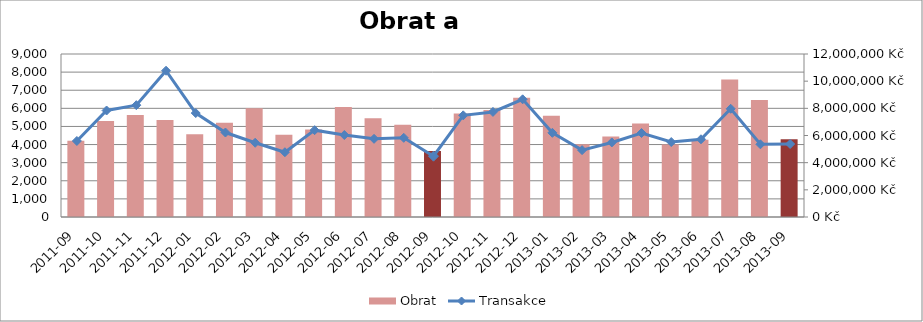
| Category | Obrat |
|---|---|
| 2011-09 | 5612646.058 |
| 2011-10 | 7072228.848 |
| 2011-11 | 7509243.464 |
| 2011-12 | 7148919.587 |
| 2012-01 | 6082847.54 |
| 2012-02 | 6929551.863 |
| 2012-03 | 8007332.551 |
| 2012-04 | 6060213.596 |
| 2012-05 | 6436799.631 |
| 2012-06 | 8104093.602 |
| 2012-07 | 7273887.04 |
| 2012-08 | 6795866.639 |
| 2012-09 | 4853668.767 |
| 2012-10 | 7625258.161 |
| 2012-11 | 7870739.351 |
| 2012-12 | 8776518.846 |
| 2013-01 | 7459715.901 |
| 2013-02 | 5362049.491 |
| 2013-03 | 5927628.751 |
| 2013-04 | 6888437.319 |
| 2013-05 | 5329917.506 |
| 2013-06 | 5690875.516 |
| 2013-07 | 10117909.344 |
| 2013-08 | 8613068.641 |
| 2013-09 | 5732651.627 |